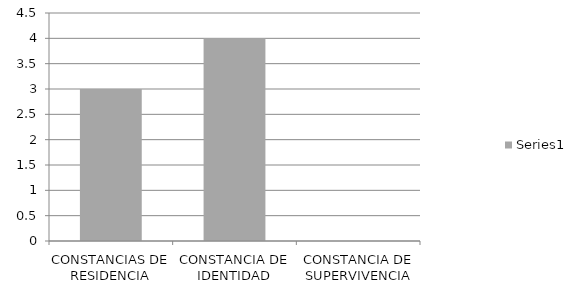
| Category | Series 0 |
|---|---|
| CONSTANCIAS DE RESIDENCIA | 3 |
| CONSTANCIA DE IDENTIDAD | 4 |
| CONSTANCIA DE SUPERVIVENCIA | 0 |